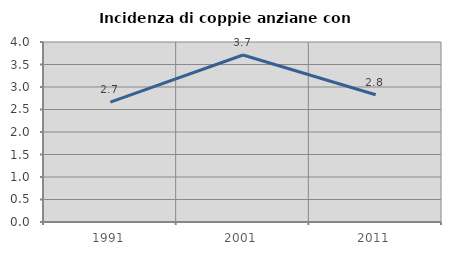
| Category | Incidenza di coppie anziane con figli |
|---|---|
| 1991.0 | 2.664 |
| 2001.0 | 3.711 |
| 2011.0 | 2.828 |